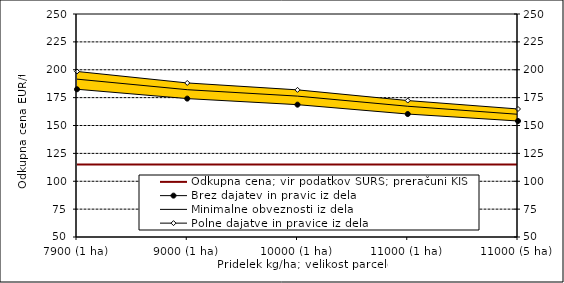
| Category | Odkupna cena; vir podatkov SURS; preračuni KIS |
|---|---|
| 7900 (1 ha) | 115 |
| 9000 (1 ha) | 115 |
| 10000 (1 ha) | 115 |
| 11000 (1 ha) | 115 |
| 11000 (5 ha) | 115 |